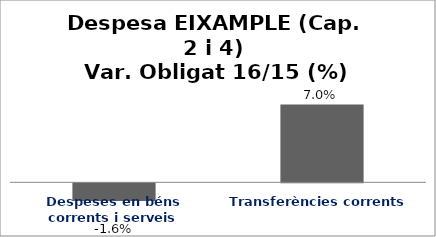
| Category | Series 0 |
|---|---|
| Despeses en béns corrents i serveis | -0.016 |
| Transferències corrents | 0.07 |